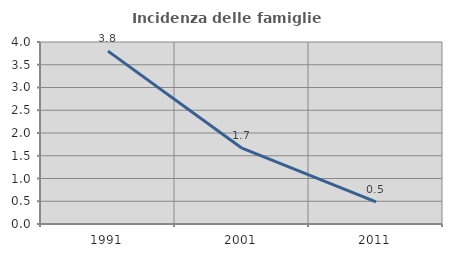
| Category | Incidenza delle famiglie numerose |
|---|---|
| 1991.0 | 3.8 |
| 2001.0 | 1.667 |
| 2011.0 | 0.488 |